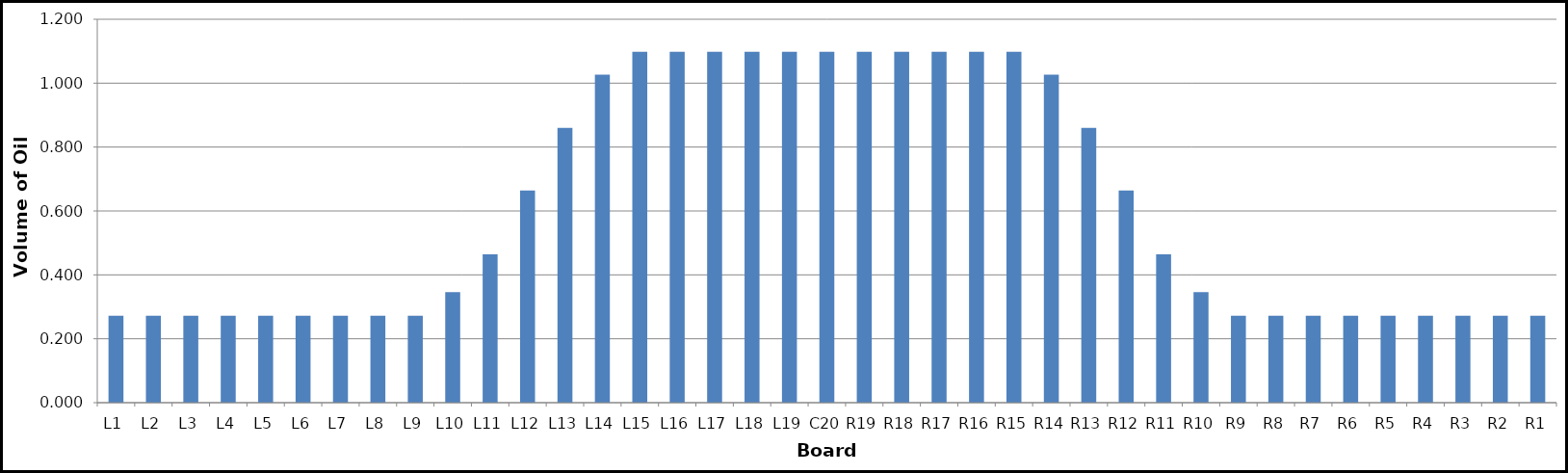
| Category | Series 0 |
|---|---|
| L1 | 0.272 |
| L2 | 0.272 |
| L3 | 0.272 |
| L4 | 0.272 |
| L5 | 0.272 |
| L6 | 0.272 |
| L7 | 0.272 |
| L8 | 0.272 |
| L9 | 0.272 |
| L10 | 0.346 |
| L11 | 0.465 |
| L12 | 0.664 |
| L13 | 0.86 |
| L14 | 1.027 |
| L15 | 1.098 |
| L16 | 1.098 |
| L17 | 1.098 |
| L18 | 1.098 |
| L19 | 1.098 |
| C20 | 1.098 |
| R19 | 1.098 |
| R18 | 1.098 |
| R17 | 1.098 |
| R16 | 1.098 |
| R15 | 1.098 |
| R14 | 1.027 |
| R13 | 0.86 |
| R12 | 0.664 |
| R11 | 0.465 |
| R10 | 0.346 |
| R9 | 0.272 |
| R8 | 0.272 |
| R7 | 0.272 |
| R6 | 0.272 |
| R5 | 0.272 |
| R4 | 0.272 |
| R3 | 0.272 |
| R2 | 0.272 |
| R1 | 0.272 |